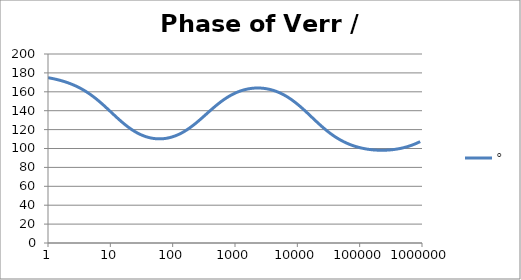
| Category | ° |
|---|---|
| 1.0 | 174.939 |
| 1.0715193052376064 | 174.579 |
| 1.1481536214968828 | 174.194 |
| 1.2302687708123814 | 173.782 |
| 1.318256738556407 | 173.342 |
| 1.4125375446227544 | 172.871 |
| 1.513561248436208 | 172.367 |
| 1.6218100973589298 | 171.829 |
| 1.7378008287493754 | 171.255 |
| 1.8620871366628673 | 170.641 |
| 1.9952623149688797 | 169.986 |
| 2.1379620895022318 | 169.287 |
| 2.2908676527677727 | 168.543 |
| 2.45470891568503 | 167.75 |
| 2.6302679918953817 | 166.906 |
| 2.8183829312644537 | 166.009 |
| 3.0199517204020156 | 165.056 |
| 3.235936569296282 | 164.046 |
| 3.467368504525316 | 162.975 |
| 3.7153522909717256 | 161.843 |
| 3.9810717055349727 | 160.648 |
| 4.265795188015926 | 159.389 |
| 4.570881896148749 | 158.065 |
| 4.897788193684462 | 156.676 |
| 5.2480746024977245 | 155.224 |
| 5.62341325190349 | 153.709 |
| 6.025595860743575 | 152.134 |
| 6.456542290346554 | 150.502 |
| 6.918309709189363 | 148.817 |
| 7.4131024130091765 | 147.086 |
| 7.943282347242814 | 145.313 |
| 8.511380382023765 | 143.506 |
| 9.120108393559095 | 141.674 |
| 9.772372209558105 | 139.825 |
| 10.47128548050899 | 137.969 |
| 11.22018454301963 | 136.115 |
| 12.022644346174127 | 134.273 |
| 12.88249551693134 | 132.455 |
| 13.803842646028851 | 130.668 |
| 14.791083881682074 | 128.922 |
| 15.848931924611136 | 127.227 |
| 16.98243652461744 | 125.589 |
| 18.197008586099834 | 124.017 |
| 19.498445997580447 | 122.515 |
| 20.892961308540382 | 121.089 |
| 22.387211385683386 | 119.744 |
| 23.988329190194897 | 118.482 |
| 25.703957827688622 | 117.307 |
| 27.54228703338165 | 116.221 |
| 29.51209226666385 | 115.224 |
| 31.62277660168379 | 114.317 |
| 33.884415613920254 | 113.501 |
| 36.307805477010106 | 112.776 |
| 38.90451449942804 | 112.142 |
| 41.686938347033525 | 111.598 |
| 44.6683592150963 | 111.144 |
| 47.86300923226381 | 110.78 |
| 51.28613839913647 | 110.506 |
| 54.95408738576247 | 110.32 |
| 58.88436553555889 | 110.222 |
| 63.09573444801931 | 110.213 |
| 67.60829753919813 | 110.293 |
| 72.44359600749901 | 110.461 |
| 77.62471166286915 | 110.717 |
| 83.17637711026705 | 111.062 |
| 89.12509381337456 | 111.497 |
| 95.49925860214357 | 112.02 |
| 102.32929922807544 | 112.633 |
| 109.64781961431841 | 113.336 |
| 117.48975549395293 | 114.129 |
| 125.89254117941665 | 115.011 |
| 134.89628825916537 | 115.981 |
| 144.54397707459273 | 117.04 |
| 154.88166189124806 | 118.184 |
| 165.95869074375608 | 119.412 |
| 177.82794100389225 | 120.722 |
| 190.5460717963248 | 122.109 |
| 204.17379446695278 | 123.568 |
| 218.77616239495524 | 125.094 |
| 234.42288153199212 | 126.682 |
| 251.18864315095806 | 128.322 |
| 269.15348039269156 | 130.008 |
| 288.4031503126605 | 131.729 |
| 309.0295432513591 | 133.477 |
| 331.1311214825911 | 135.241 |
| 354.81338923357566 | 137.011 |
| 380.18939632056095 | 138.777 |
| 407.3802778041123 | 140.528 |
| 436.5158322401654 | 142.254 |
| 467.7351412871979 | 143.947 |
| 501.18723362727184 | 145.597 |
| 537.0317963702526 | 147.197 |
| 575.4399373371566 | 148.74 |
| 616.5950018614822 | 150.221 |
| 660.6934480075952 | 151.635 |
| 707.9457843841375 | 152.977 |
| 758.5775750291831 | 154.245 |
| 812.8305161640983 | 155.436 |
| 870.9635899560801 | 156.55 |
| 933.2543007969903 | 157.584 |
| 999.9999999999998 | 158.54 |
| 1071.5193052376057 | 159.416 |
| 1148.1536214968828 | 160.213 |
| 1230.2687708123801 | 160.932 |
| 1318.2567385564053 | 161.574 |
| 1412.537544622753 | 162.139 |
| 1513.5612484362066 | 162.628 |
| 1621.8100973589292 | 163.042 |
| 1737.8008287493742 | 163.382 |
| 1862.0871366628671 | 163.648 |
| 1995.2623149688786 | 163.842 |
| 2137.9620895022326 | 163.963 |
| 2290.867652767771 | 164.011 |
| 2454.708915685027 | 163.988 |
| 2630.26799189538 | 163.892 |
| 2818.382931264451 | 163.724 |
| 3019.9517204020176 | 163.483 |
| 3235.9365692962774 | 163.168 |
| 3467.368504525316 | 162.779 |
| 3715.352290971724 | 162.315 |
| 3981.07170553497 | 161.774 |
| 4265.795188015923 | 161.157 |
| 4570.881896148745 | 160.461 |
| 4897.788193684463 | 159.686 |
| 5248.074602497726 | 158.83 |
| 5623.413251903489 | 157.894 |
| 6025.595860743574 | 156.877 |
| 6456.54229034655 | 155.778 |
| 6918.309709189357 | 154.598 |
| 7413.102413009165 | 153.337 |
| 7943.282347242815 | 151.997 |
| 8511.380382023763 | 150.581 |
| 9120.108393559092 | 149.09 |
| 9772.3722095581 | 147.529 |
| 10471.285480509003 | 145.902 |
| 11220.184543019639 | 144.216 |
| 12022.64434617411 | 142.476 |
| 12882.495516931338 | 140.691 |
| 13803.842646028841 | 138.868 |
| 14791.083881682063 | 137.017 |
| 15848.931924611119 | 135.147 |
| 16982.436524617453 | 133.267 |
| 18197.008586099837 | 131.388 |
| 19498.445997580417 | 129.52 |
| 20892.961308540387 | 127.671 |
| 22387.211385683382 | 125.852 |
| 23988.32919019488 | 124.069 |
| 25703.957827688606 | 122.33 |
| 27542.28703338167 | 120.642 |
| 29512.092266663854 | 119.011 |
| 31622.77660168378 | 117.44 |
| 33884.41561392023 | 115.933 |
| 36307.805477010166 | 114.493 |
| 38904.514499428085 | 113.121 |
| 41686.93834703348 | 111.818 |
| 44668.35921509631 | 110.585 |
| 47863.00923226382 | 109.422 |
| 51286.13839913646 | 108.326 |
| 54954.08738576241 | 107.298 |
| 58884.365535558936 | 106.336 |
| 63095.73444801934 | 105.438 |
| 67608.29753919817 | 104.602 |
| 72443.59600749899 | 103.827 |
| 77624.71166286913 | 103.109 |
| 83176.37711026703 | 102.448 |
| 89125.09381337445 | 101.841 |
| 95499.25860214363 | 101.286 |
| 102329.29922807543 | 100.781 |
| 109647.81961431848 | 100.325 |
| 117489.75549395289 | 99.916 |
| 125892.54117941685 | 99.552 |
| 134896.28825916522 | 99.232 |
| 144543.97707459255 | 98.955 |
| 154881.66189124787 | 98.72 |
| 165958.69074375575 | 98.525 |
| 177827.9410038922 | 98.37 |
| 190546.07179632425 | 98.254 |
| 204173.79446695274 | 98.177 |
| 218776.16239495497 | 98.139 |
| 234422.88153199226 | 98.139 |
| 251188.64315095753 | 98.177 |
| 269153.480392691 | 98.254 |
| 288403.15031266044 | 98.369 |
| 309029.5432513582 | 98.524 |
| 331131.1214825907 | 98.719 |
| 354813.3892335749 | 98.954 |
| 380189.3963205612 | 99.231 |
| 407380.2778041119 | 99.551 |
| 436515.8322401649 | 99.915 |
| 467735.14128719777 | 100.324 |
| 501187.2336272717 | 100.781 |
| 537031.7963702519 | 101.286 |
| 575439.9373371559 | 101.842 |
| 616595.001861482 | 102.45 |
| 660693.4480075944 | 103.112 |
| 707945.7843841374 | 103.831 |
| 758577.575029183 | 104.609 |
| 812830.5161640996 | 105.448 |
| 870963.5899560791 | 106.349 |
| 933254.3007969892 | 107.315 |